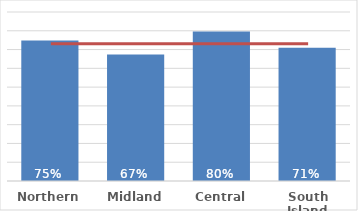
| Category | Māori |
|---|---|
| Northern | 0.748 |
| Midland | 0.673 |
| Central | 0.797 |
| South Island | 0.71 |